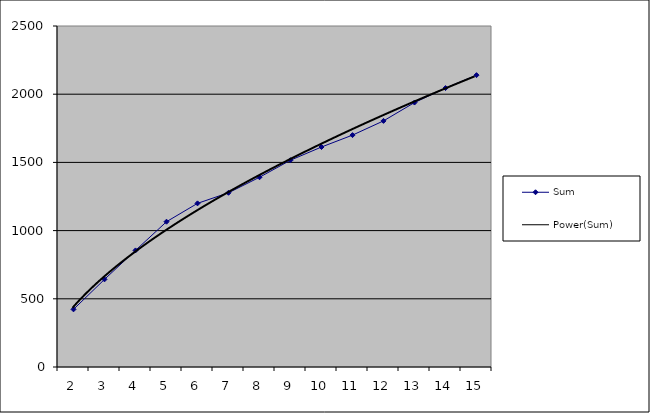
| Category | Sum |
|---|---|
| 2.0 | 422.637 |
| 3.0 | 642.484 |
| 4.0 | 854.75 |
| 5.0 | 1065.121 |
| 6.0 | 1199.682 |
| 7.0 | 1277.387 |
| 8.0 | 1391.101 |
| 9.0 | 1516.186 |
| 10.0 | 1612.843 |
| 11.0 | 1700.024 |
| 12.0 | 1804.261 |
| 13.0 | 1938.823 |
| 14.0 | 2044.956 |
| 15.0 | 2139.718 |